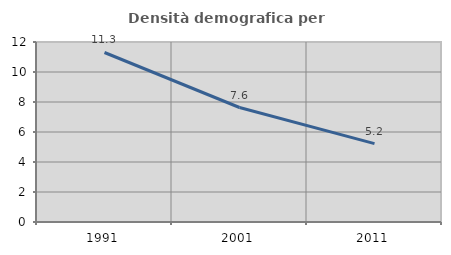
| Category | Densità demografica |
|---|---|
| 1991.0 | 11.3 |
| 2001.0 | 7.632 |
| 2011.0 | 5.224 |